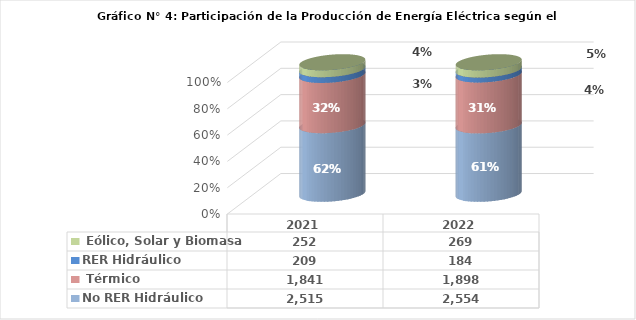
| Category | No RER | RER |
|---|---|---|
| 2021.0 | 1840.511 | 251.82 |
| 2022.0 | 1897.922 | 269.24 |